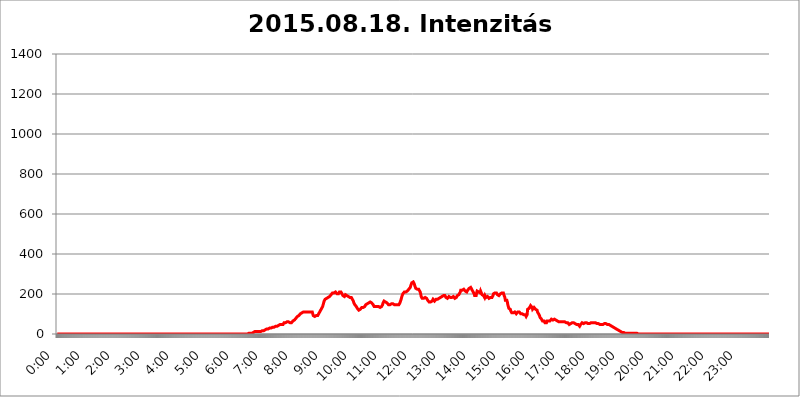
| Category | 2015.08.18. Intenzitás [W/m^2] |
|---|---|
| 0.0 | 0 |
| 0.0006944444444444445 | 0 |
| 0.001388888888888889 | 0 |
| 0.0020833333333333333 | 0 |
| 0.002777777777777778 | 0 |
| 0.003472222222222222 | 0 |
| 0.004166666666666667 | 0 |
| 0.004861111111111111 | 0 |
| 0.005555555555555556 | 0 |
| 0.0062499999999999995 | 0 |
| 0.006944444444444444 | 0 |
| 0.007638888888888889 | 0 |
| 0.008333333333333333 | 0 |
| 0.009027777777777779 | 0 |
| 0.009722222222222222 | 0 |
| 0.010416666666666666 | 0 |
| 0.011111111111111112 | 0 |
| 0.011805555555555555 | 0 |
| 0.012499999999999999 | 0 |
| 0.013194444444444444 | 0 |
| 0.013888888888888888 | 0 |
| 0.014583333333333332 | 0 |
| 0.015277777777777777 | 0 |
| 0.015972222222222224 | 0 |
| 0.016666666666666666 | 0 |
| 0.017361111111111112 | 0 |
| 0.018055555555555557 | 0 |
| 0.01875 | 0 |
| 0.019444444444444445 | 0 |
| 0.02013888888888889 | 0 |
| 0.020833333333333332 | 0 |
| 0.02152777777777778 | 0 |
| 0.022222222222222223 | 0 |
| 0.02291666666666667 | 0 |
| 0.02361111111111111 | 0 |
| 0.024305555555555556 | 0 |
| 0.024999999999999998 | 0 |
| 0.025694444444444447 | 0 |
| 0.02638888888888889 | 0 |
| 0.027083333333333334 | 0 |
| 0.027777777777777776 | 0 |
| 0.02847222222222222 | 0 |
| 0.029166666666666664 | 0 |
| 0.029861111111111113 | 0 |
| 0.030555555555555555 | 0 |
| 0.03125 | 0 |
| 0.03194444444444445 | 0 |
| 0.03263888888888889 | 0 |
| 0.03333333333333333 | 0 |
| 0.034027777777777775 | 0 |
| 0.034722222222222224 | 0 |
| 0.035416666666666666 | 0 |
| 0.036111111111111115 | 0 |
| 0.03680555555555556 | 0 |
| 0.0375 | 0 |
| 0.03819444444444444 | 0 |
| 0.03888888888888889 | 0 |
| 0.03958333333333333 | 0 |
| 0.04027777777777778 | 0 |
| 0.04097222222222222 | 0 |
| 0.041666666666666664 | 0 |
| 0.042361111111111106 | 0 |
| 0.04305555555555556 | 0 |
| 0.043750000000000004 | 0 |
| 0.044444444444444446 | 0 |
| 0.04513888888888889 | 0 |
| 0.04583333333333334 | 0 |
| 0.04652777777777778 | 0 |
| 0.04722222222222222 | 0 |
| 0.04791666666666666 | 0 |
| 0.04861111111111111 | 0 |
| 0.049305555555555554 | 0 |
| 0.049999999999999996 | 0 |
| 0.05069444444444445 | 0 |
| 0.051388888888888894 | 0 |
| 0.052083333333333336 | 0 |
| 0.05277777777777778 | 0 |
| 0.05347222222222222 | 0 |
| 0.05416666666666667 | 0 |
| 0.05486111111111111 | 0 |
| 0.05555555555555555 | 0 |
| 0.05625 | 0 |
| 0.05694444444444444 | 0 |
| 0.057638888888888885 | 0 |
| 0.05833333333333333 | 0 |
| 0.05902777777777778 | 0 |
| 0.059722222222222225 | 0 |
| 0.06041666666666667 | 0 |
| 0.061111111111111116 | 0 |
| 0.06180555555555556 | 0 |
| 0.0625 | 0 |
| 0.06319444444444444 | 0 |
| 0.06388888888888888 | 0 |
| 0.06458333333333334 | 0 |
| 0.06527777777777778 | 0 |
| 0.06597222222222222 | 0 |
| 0.06666666666666667 | 0 |
| 0.06736111111111111 | 0 |
| 0.06805555555555555 | 0 |
| 0.06874999999999999 | 0 |
| 0.06944444444444443 | 0 |
| 0.07013888888888889 | 0 |
| 0.07083333333333333 | 0 |
| 0.07152777777777779 | 0 |
| 0.07222222222222223 | 0 |
| 0.07291666666666667 | 0 |
| 0.07361111111111111 | 0 |
| 0.07430555555555556 | 0 |
| 0.075 | 0 |
| 0.07569444444444444 | 0 |
| 0.0763888888888889 | 0 |
| 0.07708333333333334 | 0 |
| 0.07777777777777778 | 0 |
| 0.07847222222222222 | 0 |
| 0.07916666666666666 | 0 |
| 0.0798611111111111 | 0 |
| 0.08055555555555556 | 0 |
| 0.08125 | 0 |
| 0.08194444444444444 | 0 |
| 0.08263888888888889 | 0 |
| 0.08333333333333333 | 0 |
| 0.08402777777777777 | 0 |
| 0.08472222222222221 | 0 |
| 0.08541666666666665 | 0 |
| 0.08611111111111112 | 0 |
| 0.08680555555555557 | 0 |
| 0.08750000000000001 | 0 |
| 0.08819444444444445 | 0 |
| 0.08888888888888889 | 0 |
| 0.08958333333333333 | 0 |
| 0.09027777777777778 | 0 |
| 0.09097222222222222 | 0 |
| 0.09166666666666667 | 0 |
| 0.09236111111111112 | 0 |
| 0.09305555555555556 | 0 |
| 0.09375 | 0 |
| 0.09444444444444444 | 0 |
| 0.09513888888888888 | 0 |
| 0.09583333333333333 | 0 |
| 0.09652777777777777 | 0 |
| 0.09722222222222222 | 0 |
| 0.09791666666666667 | 0 |
| 0.09861111111111111 | 0 |
| 0.09930555555555555 | 0 |
| 0.09999999999999999 | 0 |
| 0.10069444444444443 | 0 |
| 0.1013888888888889 | 0 |
| 0.10208333333333335 | 0 |
| 0.10277777777777779 | 0 |
| 0.10347222222222223 | 0 |
| 0.10416666666666667 | 0 |
| 0.10486111111111111 | 0 |
| 0.10555555555555556 | 0 |
| 0.10625 | 0 |
| 0.10694444444444444 | 0 |
| 0.1076388888888889 | 0 |
| 0.10833333333333334 | 0 |
| 0.10902777777777778 | 0 |
| 0.10972222222222222 | 0 |
| 0.1111111111111111 | 0 |
| 0.11180555555555556 | 0 |
| 0.11180555555555556 | 0 |
| 0.1125 | 0 |
| 0.11319444444444444 | 0 |
| 0.11388888888888889 | 0 |
| 0.11458333333333333 | 0 |
| 0.11527777777777777 | 0 |
| 0.11597222222222221 | 0 |
| 0.11666666666666665 | 0 |
| 0.1173611111111111 | 0 |
| 0.11805555555555557 | 0 |
| 0.11944444444444445 | 0 |
| 0.12013888888888889 | 0 |
| 0.12083333333333333 | 0 |
| 0.12152777777777778 | 0 |
| 0.12222222222222223 | 0 |
| 0.12291666666666667 | 0 |
| 0.12291666666666667 | 0 |
| 0.12361111111111112 | 0 |
| 0.12430555555555556 | 0 |
| 0.125 | 0 |
| 0.12569444444444444 | 0 |
| 0.12638888888888888 | 0 |
| 0.12708333333333333 | 0 |
| 0.16875 | 0 |
| 0.12847222222222224 | 0 |
| 0.12916666666666668 | 0 |
| 0.12986111111111112 | 0 |
| 0.13055555555555556 | 0 |
| 0.13125 | 0 |
| 0.13194444444444445 | 0 |
| 0.1326388888888889 | 0 |
| 0.13333333333333333 | 0 |
| 0.13402777777777777 | 0 |
| 0.13402777777777777 | 0 |
| 0.13472222222222222 | 0 |
| 0.13541666666666666 | 0 |
| 0.1361111111111111 | 0 |
| 0.13749999999999998 | 0 |
| 0.13819444444444443 | 0 |
| 0.1388888888888889 | 0 |
| 0.13958333333333334 | 0 |
| 0.14027777777777778 | 0 |
| 0.14097222222222222 | 0 |
| 0.14166666666666666 | 0 |
| 0.1423611111111111 | 0 |
| 0.14305555555555557 | 0 |
| 0.14375000000000002 | 0 |
| 0.14444444444444446 | 0 |
| 0.1451388888888889 | 0 |
| 0.1451388888888889 | 0 |
| 0.14652777777777778 | 0 |
| 0.14722222222222223 | 0 |
| 0.14791666666666667 | 0 |
| 0.1486111111111111 | 0 |
| 0.14930555555555555 | 0 |
| 0.15 | 0 |
| 0.15069444444444444 | 0 |
| 0.15138888888888888 | 0 |
| 0.15208333333333332 | 0 |
| 0.15277777777777776 | 0 |
| 0.15347222222222223 | 0 |
| 0.15416666666666667 | 0 |
| 0.15486111111111112 | 0 |
| 0.15555555555555556 | 0 |
| 0.15625 | 0 |
| 0.15694444444444444 | 0 |
| 0.15763888888888888 | 0 |
| 0.15833333333333333 | 0 |
| 0.15902777777777777 | 0 |
| 0.15972222222222224 | 0 |
| 0.16041666666666668 | 0 |
| 0.16111111111111112 | 0 |
| 0.16180555555555556 | 0 |
| 0.1625 | 0 |
| 0.16319444444444445 | 0 |
| 0.1638888888888889 | 0 |
| 0.16458333333333333 | 0 |
| 0.16527777777777777 | 0 |
| 0.16597222222222222 | 0 |
| 0.16666666666666666 | 0 |
| 0.1673611111111111 | 0 |
| 0.16805555555555554 | 0 |
| 0.16874999999999998 | 0 |
| 0.16944444444444443 | 0 |
| 0.17013888888888887 | 0 |
| 0.1708333333333333 | 0 |
| 0.17152777777777775 | 0 |
| 0.17222222222222225 | 0 |
| 0.1729166666666667 | 0 |
| 0.17361111111111113 | 0 |
| 0.17430555555555557 | 0 |
| 0.17500000000000002 | 0 |
| 0.17569444444444446 | 0 |
| 0.1763888888888889 | 0 |
| 0.17708333333333334 | 0 |
| 0.17777777777777778 | 0 |
| 0.17847222222222223 | 0 |
| 0.17916666666666667 | 0 |
| 0.1798611111111111 | 0 |
| 0.18055555555555555 | 0 |
| 0.18125 | 0 |
| 0.18194444444444444 | 0 |
| 0.1826388888888889 | 0 |
| 0.18333333333333335 | 0 |
| 0.1840277777777778 | 0 |
| 0.18472222222222223 | 0 |
| 0.18541666666666667 | 0 |
| 0.18611111111111112 | 0 |
| 0.18680555555555556 | 0 |
| 0.1875 | 0 |
| 0.18819444444444444 | 0 |
| 0.18888888888888888 | 0 |
| 0.18958333333333333 | 0 |
| 0.19027777777777777 | 0 |
| 0.1909722222222222 | 0 |
| 0.19166666666666665 | 0 |
| 0.19236111111111112 | 0 |
| 0.19305555555555554 | 0 |
| 0.19375 | 0 |
| 0.19444444444444445 | 0 |
| 0.1951388888888889 | 0 |
| 0.19583333333333333 | 0 |
| 0.19652777777777777 | 0 |
| 0.19722222222222222 | 0 |
| 0.19791666666666666 | 0 |
| 0.1986111111111111 | 0 |
| 0.19930555555555554 | 0 |
| 0.19999999999999998 | 0 |
| 0.20069444444444443 | 0 |
| 0.20138888888888887 | 0 |
| 0.2020833333333333 | 0 |
| 0.2027777777777778 | 0 |
| 0.2034722222222222 | 0 |
| 0.2041666666666667 | 0 |
| 0.20486111111111113 | 0 |
| 0.20555555555555557 | 0 |
| 0.20625000000000002 | 0 |
| 0.20694444444444446 | 0 |
| 0.2076388888888889 | 0 |
| 0.20833333333333334 | 0 |
| 0.20902777777777778 | 0 |
| 0.20972222222222223 | 0 |
| 0.21041666666666667 | 0 |
| 0.2111111111111111 | 0 |
| 0.21180555555555555 | 0 |
| 0.2125 | 0 |
| 0.21319444444444444 | 0 |
| 0.2138888888888889 | 0 |
| 0.21458333333333335 | 0 |
| 0.2152777777777778 | 0 |
| 0.21597222222222223 | 0 |
| 0.21666666666666667 | 0 |
| 0.21736111111111112 | 0 |
| 0.21805555555555556 | 0 |
| 0.21875 | 0 |
| 0.21944444444444444 | 0 |
| 0.22013888888888888 | 0 |
| 0.22083333333333333 | 0 |
| 0.22152777777777777 | 0 |
| 0.2222222222222222 | 0 |
| 0.22291666666666665 | 0 |
| 0.2236111111111111 | 0 |
| 0.22430555555555556 | 0 |
| 0.225 | 0 |
| 0.22569444444444445 | 0 |
| 0.2263888888888889 | 0 |
| 0.22708333333333333 | 0 |
| 0.22777777777777777 | 0 |
| 0.22847222222222222 | 0 |
| 0.22916666666666666 | 0 |
| 0.2298611111111111 | 0 |
| 0.23055555555555554 | 0 |
| 0.23124999999999998 | 0 |
| 0.23194444444444443 | 0 |
| 0.23263888888888887 | 0 |
| 0.2333333333333333 | 0 |
| 0.2340277777777778 | 0 |
| 0.2347222222222222 | 0 |
| 0.2354166666666667 | 0 |
| 0.23611111111111113 | 0 |
| 0.23680555555555557 | 0 |
| 0.23750000000000002 | 0 |
| 0.23819444444444446 | 0 |
| 0.2388888888888889 | 0 |
| 0.23958333333333334 | 0 |
| 0.24027777777777778 | 0 |
| 0.24097222222222223 | 0 |
| 0.24166666666666667 | 0 |
| 0.2423611111111111 | 0 |
| 0.24305555555555555 | 0 |
| 0.24375 | 0 |
| 0.24444444444444446 | 0 |
| 0.24513888888888888 | 0 |
| 0.24583333333333335 | 0 |
| 0.2465277777777778 | 0 |
| 0.24722222222222223 | 0 |
| 0.24791666666666667 | 0 |
| 0.24861111111111112 | 0 |
| 0.24930555555555556 | 0 |
| 0.25 | 0 |
| 0.25069444444444444 | 0 |
| 0.2513888888888889 | 0 |
| 0.2520833333333333 | 0 |
| 0.25277777777777777 | 0 |
| 0.2534722222222222 | 0 |
| 0.25416666666666665 | 0 |
| 0.2548611111111111 | 0 |
| 0.2555555555555556 | 0 |
| 0.25625000000000003 | 0 |
| 0.2569444444444445 | 0 |
| 0.2576388888888889 | 0 |
| 0.25833333333333336 | 0 |
| 0.2590277777777778 | 0 |
| 0.25972222222222224 | 0 |
| 0.2604166666666667 | 0 |
| 0.2611111111111111 | 3.525 |
| 0.26180555555555557 | 0 |
| 0.2625 | 0 |
| 0.26319444444444445 | 0 |
| 0.2638888888888889 | 0 |
| 0.26458333333333334 | 0 |
| 0.2652777777777778 | 0 |
| 0.2659722222222222 | 0 |
| 0.26666666666666666 | 0 |
| 0.2673611111111111 | 3.525 |
| 0.26805555555555555 | 3.525 |
| 0.26875 | 3.525 |
| 0.26944444444444443 | 3.525 |
| 0.2701388888888889 | 3.525 |
| 0.2708333333333333 | 3.525 |
| 0.27152777777777776 | 3.525 |
| 0.2722222222222222 | 3.525 |
| 0.27291666666666664 | 3.525 |
| 0.2736111111111111 | 3.525 |
| 0.2743055555555555 | 7.887 |
| 0.27499999999999997 | 7.887 |
| 0.27569444444444446 | 7.887 |
| 0.27638888888888885 | 12.257 |
| 0.27708333333333335 | 12.257 |
| 0.2777777777777778 | 12.257 |
| 0.27847222222222223 | 12.257 |
| 0.2791666666666667 | 12.257 |
| 0.2798611111111111 | 12.257 |
| 0.28055555555555556 | 12.257 |
| 0.28125 | 12.257 |
| 0.28194444444444444 | 12.257 |
| 0.2826388888888889 | 12.257 |
| 0.2833333333333333 | 12.257 |
| 0.28402777777777777 | 12.257 |
| 0.2847222222222222 | 12.257 |
| 0.28541666666666665 | 12.257 |
| 0.28611111111111115 | 12.257 |
| 0.28680555555555554 | 16.636 |
| 0.28750000000000003 | 16.636 |
| 0.2881944444444445 | 16.636 |
| 0.2888888888888889 | 16.636 |
| 0.28958333333333336 | 16.636 |
| 0.2902777777777778 | 16.636 |
| 0.29097222222222224 | 21.024 |
| 0.2916666666666667 | 21.024 |
| 0.2923611111111111 | 21.024 |
| 0.29305555555555557 | 21.024 |
| 0.29375 | 25.419 |
| 0.29444444444444445 | 25.419 |
| 0.2951388888888889 | 25.419 |
| 0.29583333333333334 | 25.419 |
| 0.2965277777777778 | 29.823 |
| 0.2972222222222222 | 29.823 |
| 0.29791666666666666 | 29.823 |
| 0.2986111111111111 | 29.823 |
| 0.29930555555555555 | 29.823 |
| 0.3 | 29.823 |
| 0.30069444444444443 | 34.234 |
| 0.3013888888888889 | 34.234 |
| 0.3020833333333333 | 34.234 |
| 0.30277777777777776 | 34.234 |
| 0.3034722222222222 | 34.234 |
| 0.30416666666666664 | 34.234 |
| 0.3048611111111111 | 38.653 |
| 0.3055555555555555 | 38.653 |
| 0.30624999999999997 | 38.653 |
| 0.3069444444444444 | 38.653 |
| 0.3076388888888889 | 38.653 |
| 0.30833333333333335 | 38.653 |
| 0.3090277777777778 | 38.653 |
| 0.30972222222222223 | 43.079 |
| 0.3104166666666667 | 43.079 |
| 0.3111111111111111 | 47.511 |
| 0.31180555555555556 | 47.511 |
| 0.3125 | 47.511 |
| 0.31319444444444444 | 47.511 |
| 0.3138888888888889 | 47.511 |
| 0.3145833333333333 | 47.511 |
| 0.31527777777777777 | 47.511 |
| 0.3159722222222222 | 47.511 |
| 0.31666666666666665 | 47.511 |
| 0.31736111111111115 | 51.951 |
| 0.31805555555555554 | 56.398 |
| 0.31875000000000003 | 56.398 |
| 0.3194444444444445 | 56.398 |
| 0.3201388888888889 | 56.398 |
| 0.32083333333333336 | 56.398 |
| 0.3215277777777778 | 60.85 |
| 0.32222222222222224 | 60.85 |
| 0.3229166666666667 | 60.85 |
| 0.3236111111111111 | 60.85 |
| 0.32430555555555557 | 60.85 |
| 0.325 | 60.85 |
| 0.32569444444444445 | 60.85 |
| 0.3263888888888889 | 56.398 |
| 0.32708333333333334 | 56.398 |
| 0.3277777777777778 | 56.398 |
| 0.3284722222222222 | 56.398 |
| 0.32916666666666666 | 60.85 |
| 0.3298611111111111 | 60.85 |
| 0.33055555555555555 | 65.31 |
| 0.33125 | 69.775 |
| 0.33194444444444443 | 69.775 |
| 0.3326388888888889 | 69.775 |
| 0.3333333333333333 | 74.246 |
| 0.3340277777777778 | 74.246 |
| 0.3347222222222222 | 78.722 |
| 0.3354166666666667 | 78.722 |
| 0.3361111111111111 | 83.205 |
| 0.3368055555555556 | 87.692 |
| 0.33749999999999997 | 87.692 |
| 0.33819444444444446 | 92.184 |
| 0.33888888888888885 | 92.184 |
| 0.33958333333333335 | 96.682 |
| 0.34027777777777773 | 96.682 |
| 0.34097222222222223 | 101.184 |
| 0.3416666666666666 | 101.184 |
| 0.3423611111111111 | 101.184 |
| 0.3430555555555555 | 105.69 |
| 0.34375 | 105.69 |
| 0.3444444444444445 | 105.69 |
| 0.3451388888888889 | 110.201 |
| 0.3458333333333334 | 110.201 |
| 0.34652777777777777 | 110.201 |
| 0.34722222222222227 | 110.201 |
| 0.34791666666666665 | 110.201 |
| 0.34861111111111115 | 110.201 |
| 0.34930555555555554 | 110.201 |
| 0.35000000000000003 | 110.201 |
| 0.3506944444444444 | 110.201 |
| 0.3513888888888889 | 110.201 |
| 0.3520833333333333 | 110.201 |
| 0.3527777777777778 | 110.201 |
| 0.3534722222222222 | 110.201 |
| 0.3541666666666667 | 114.716 |
| 0.3548611111111111 | 110.201 |
| 0.35555555555555557 | 110.201 |
| 0.35625 | 110.201 |
| 0.35694444444444445 | 110.201 |
| 0.3576388888888889 | 110.201 |
| 0.35833333333333334 | 110.201 |
| 0.3590277777777778 | 92.184 |
| 0.3597222222222222 | 92.184 |
| 0.36041666666666666 | 87.692 |
| 0.3611111111111111 | 87.692 |
| 0.36180555555555555 | 87.692 |
| 0.3625 | 92.184 |
| 0.36319444444444443 | 92.184 |
| 0.3638888888888889 | 92.184 |
| 0.3645833333333333 | 92.184 |
| 0.3652777777777778 | 92.184 |
| 0.3659722222222222 | 96.682 |
| 0.3666666666666667 | 101.184 |
| 0.3673611111111111 | 101.184 |
| 0.3680555555555556 | 110.201 |
| 0.36874999999999997 | 114.716 |
| 0.36944444444444446 | 119.235 |
| 0.37013888888888885 | 123.758 |
| 0.37083333333333335 | 128.284 |
| 0.37152777777777773 | 132.814 |
| 0.37222222222222223 | 137.347 |
| 0.3729166666666666 | 146.423 |
| 0.3736111111111111 | 155.509 |
| 0.3743055555555555 | 164.605 |
| 0.375 | 169.156 |
| 0.3756944444444445 | 173.709 |
| 0.3763888888888889 | 178.264 |
| 0.3770833333333334 | 178.264 |
| 0.37777777777777777 | 178.264 |
| 0.37847222222222227 | 178.264 |
| 0.37916666666666665 | 182.82 |
| 0.37986111111111115 | 182.82 |
| 0.38055555555555554 | 182.82 |
| 0.38125000000000003 | 187.378 |
| 0.3819444444444444 | 187.378 |
| 0.3826388888888889 | 191.937 |
| 0.3833333333333333 | 191.937 |
| 0.3840277777777778 | 196.497 |
| 0.3847222222222222 | 201.058 |
| 0.3854166666666667 | 201.058 |
| 0.3861111111111111 | 205.62 |
| 0.38680555555555557 | 205.62 |
| 0.3875 | 205.62 |
| 0.38819444444444445 | 205.62 |
| 0.3888888888888889 | 210.182 |
| 0.38958333333333334 | 210.182 |
| 0.3902777777777778 | 210.182 |
| 0.3909722222222222 | 205.62 |
| 0.39166666666666666 | 205.62 |
| 0.3923611111111111 | 201.058 |
| 0.39305555555555555 | 201.058 |
| 0.39375 | 201.058 |
| 0.39444444444444443 | 201.058 |
| 0.3951388888888889 | 205.62 |
| 0.3958333333333333 | 210.182 |
| 0.3965277777777778 | 210.182 |
| 0.3972222222222222 | 210.182 |
| 0.3979166666666667 | 210.182 |
| 0.3986111111111111 | 205.62 |
| 0.3993055555555556 | 201.058 |
| 0.39999999999999997 | 196.497 |
| 0.40069444444444446 | 191.937 |
| 0.40138888888888885 | 187.378 |
| 0.40208333333333335 | 187.378 |
| 0.40277777777777773 | 187.378 |
| 0.40347222222222223 | 191.937 |
| 0.4041666666666666 | 196.497 |
| 0.4048611111111111 | 196.497 |
| 0.4055555555555555 | 196.497 |
| 0.40625 | 191.937 |
| 0.4069444444444445 | 191.937 |
| 0.4076388888888889 | 191.937 |
| 0.4083333333333334 | 187.378 |
| 0.40902777777777777 | 187.378 |
| 0.40972222222222227 | 187.378 |
| 0.41041666666666665 | 182.82 |
| 0.41111111111111115 | 182.82 |
| 0.41180555555555554 | 182.82 |
| 0.41250000000000003 | 182.82 |
| 0.4131944444444444 | 178.264 |
| 0.4138888888888889 | 173.709 |
| 0.4145833333333333 | 169.156 |
| 0.4152777777777778 | 164.605 |
| 0.4159722222222222 | 155.509 |
| 0.4166666666666667 | 150.964 |
| 0.4173611111111111 | 146.423 |
| 0.41805555555555557 | 146.423 |
| 0.41875 | 141.884 |
| 0.41944444444444445 | 137.347 |
| 0.4201388888888889 | 132.814 |
| 0.42083333333333334 | 128.284 |
| 0.4215277777777778 | 128.284 |
| 0.4222222222222222 | 123.758 |
| 0.42291666666666666 | 119.235 |
| 0.4236111111111111 | 119.235 |
| 0.42430555555555555 | 119.235 |
| 0.425 | 123.758 |
| 0.42569444444444443 | 123.758 |
| 0.4263888888888889 | 128.284 |
| 0.4270833333333333 | 132.814 |
| 0.4277777777777778 | 132.814 |
| 0.4284722222222222 | 132.814 |
| 0.4291666666666667 | 132.814 |
| 0.4298611111111111 | 132.814 |
| 0.4305555555555556 | 132.814 |
| 0.43124999999999997 | 137.347 |
| 0.43194444444444446 | 141.884 |
| 0.43263888888888885 | 146.423 |
| 0.43333333333333335 | 146.423 |
| 0.43402777777777773 | 150.964 |
| 0.43472222222222223 | 150.964 |
| 0.4354166666666666 | 150.964 |
| 0.4361111111111111 | 155.509 |
| 0.4368055555555555 | 155.509 |
| 0.4375 | 160.056 |
| 0.4381944444444445 | 160.056 |
| 0.4388888888888889 | 160.056 |
| 0.4395833333333334 | 160.056 |
| 0.44027777777777777 | 160.056 |
| 0.44097222222222227 | 155.509 |
| 0.44166666666666665 | 155.509 |
| 0.44236111111111115 | 150.964 |
| 0.44305555555555554 | 146.423 |
| 0.44375000000000003 | 141.884 |
| 0.4444444444444444 | 137.347 |
| 0.4451388888888889 | 132.814 |
| 0.4458333333333333 | 137.347 |
| 0.4465277777777778 | 137.347 |
| 0.4472222222222222 | 137.347 |
| 0.4479166666666667 | 137.347 |
| 0.4486111111111111 | 137.347 |
| 0.44930555555555557 | 137.347 |
| 0.45 | 137.347 |
| 0.45069444444444445 | 137.347 |
| 0.4513888888888889 | 137.347 |
| 0.45208333333333334 | 132.814 |
| 0.4527777777777778 | 132.814 |
| 0.4534722222222222 | 137.347 |
| 0.45416666666666666 | 137.347 |
| 0.4548611111111111 | 137.347 |
| 0.45555555555555555 | 141.884 |
| 0.45625 | 146.423 |
| 0.45694444444444443 | 155.509 |
| 0.4576388888888889 | 160.056 |
| 0.4583333333333333 | 164.605 |
| 0.4590277777777778 | 164.605 |
| 0.4597222222222222 | 164.605 |
| 0.4604166666666667 | 160.056 |
| 0.4611111111111111 | 160.056 |
| 0.4618055555555556 | 155.509 |
| 0.46249999999999997 | 155.509 |
| 0.46319444444444446 | 150.964 |
| 0.46388888888888885 | 150.964 |
| 0.46458333333333335 | 146.423 |
| 0.46527777777777773 | 146.423 |
| 0.46597222222222223 | 146.423 |
| 0.4666666666666666 | 146.423 |
| 0.4673611111111111 | 146.423 |
| 0.4680555555555555 | 150.964 |
| 0.46875 | 150.964 |
| 0.4694444444444445 | 150.964 |
| 0.4701388888888889 | 150.964 |
| 0.4708333333333334 | 150.964 |
| 0.47152777777777777 | 150.964 |
| 0.47222222222222227 | 150.964 |
| 0.47291666666666665 | 146.423 |
| 0.47361111111111115 | 150.964 |
| 0.47430555555555554 | 150.964 |
| 0.47500000000000003 | 146.423 |
| 0.4756944444444444 | 150.964 |
| 0.4763888888888889 | 146.423 |
| 0.4770833333333333 | 146.423 |
| 0.4777777777777778 | 146.423 |
| 0.4784722222222222 | 146.423 |
| 0.4791666666666667 | 146.423 |
| 0.4798611111111111 | 150.964 |
| 0.48055555555555557 | 155.509 |
| 0.48125 | 160.056 |
| 0.48194444444444445 | 169.156 |
| 0.4826388888888889 | 178.264 |
| 0.48333333333333334 | 187.378 |
| 0.4840277777777778 | 191.937 |
| 0.4847222222222222 | 201.058 |
| 0.48541666666666666 | 205.62 |
| 0.4861111111111111 | 205.62 |
| 0.48680555555555555 | 210.182 |
| 0.4875 | 210.182 |
| 0.48819444444444443 | 210.182 |
| 0.4888888888888889 | 210.182 |
| 0.4895833333333333 | 214.746 |
| 0.4902777777777778 | 214.746 |
| 0.4909722222222222 | 214.746 |
| 0.4916666666666667 | 214.746 |
| 0.4923611111111111 | 219.309 |
| 0.4930555555555556 | 223.873 |
| 0.49374999999999997 | 228.436 |
| 0.49444444444444446 | 228.436 |
| 0.49513888888888885 | 233 |
| 0.49583333333333335 | 242.127 |
| 0.49652777777777773 | 246.689 |
| 0.49722222222222223 | 255.813 |
| 0.4979166666666666 | 260.373 |
| 0.4986111111111111 | 260.373 |
| 0.4993055555555555 | 260.373 |
| 0.5 | 255.813 |
| 0.5006944444444444 | 251.251 |
| 0.5013888888888889 | 242.127 |
| 0.5020833333333333 | 237.564 |
| 0.5027777777777778 | 228.436 |
| 0.5034722222222222 | 228.436 |
| 0.5041666666666667 | 223.873 |
| 0.5048611111111111 | 223.873 |
| 0.5055555555555555 | 219.309 |
| 0.50625 | 223.873 |
| 0.5069444444444444 | 223.873 |
| 0.5076388888888889 | 223.873 |
| 0.5083333333333333 | 219.309 |
| 0.5090277777777777 | 210.182 |
| 0.5097222222222222 | 201.058 |
| 0.5104166666666666 | 187.378 |
| 0.5111111111111112 | 182.82 |
| 0.5118055555555555 | 178.264 |
| 0.5125000000000001 | 178.264 |
| 0.5131944444444444 | 178.264 |
| 0.513888888888889 | 178.264 |
| 0.5145833333333333 | 178.264 |
| 0.5152777777777778 | 182.82 |
| 0.5159722222222222 | 182.82 |
| 0.5166666666666667 | 182.82 |
| 0.517361111111111 | 182.82 |
| 0.5180555555555556 | 178.264 |
| 0.5187499999999999 | 173.709 |
| 0.5194444444444445 | 169.156 |
| 0.5201388888888888 | 164.605 |
| 0.5208333333333334 | 164.605 |
| 0.5215277777777778 | 160.056 |
| 0.5222222222222223 | 160.056 |
| 0.5229166666666667 | 160.056 |
| 0.5236111111111111 | 160.056 |
| 0.5243055555555556 | 160.056 |
| 0.525 | 164.605 |
| 0.5256944444444445 | 164.605 |
| 0.5263888888888889 | 169.156 |
| 0.5270833333333333 | 173.709 |
| 0.5277777777777778 | 169.156 |
| 0.5284722222222222 | 169.156 |
| 0.5291666666666667 | 164.605 |
| 0.5298611111111111 | 164.605 |
| 0.5305555555555556 | 169.156 |
| 0.53125 | 173.709 |
| 0.5319444444444444 | 173.709 |
| 0.5326388888888889 | 173.709 |
| 0.5333333333333333 | 173.709 |
| 0.5340277777777778 | 173.709 |
| 0.5347222222222222 | 173.709 |
| 0.5354166666666667 | 178.264 |
| 0.5361111111111111 | 182.82 |
| 0.5368055555555555 | 182.82 |
| 0.5375 | 182.82 |
| 0.5381944444444444 | 182.82 |
| 0.5388888888888889 | 187.378 |
| 0.5395833333333333 | 187.378 |
| 0.5402777777777777 | 187.378 |
| 0.5409722222222222 | 187.378 |
| 0.5416666666666666 | 191.937 |
| 0.5423611111111112 | 191.937 |
| 0.5430555555555555 | 196.497 |
| 0.5437500000000001 | 191.937 |
| 0.5444444444444444 | 187.378 |
| 0.545138888888889 | 182.82 |
| 0.5458333333333333 | 178.264 |
| 0.5465277777777778 | 178.264 |
| 0.5472222222222222 | 178.264 |
| 0.5479166666666667 | 182.82 |
| 0.548611111111111 | 182.82 |
| 0.5493055555555556 | 187.378 |
| 0.5499999999999999 | 187.378 |
| 0.5506944444444445 | 187.378 |
| 0.5513888888888888 | 182.82 |
| 0.5520833333333334 | 182.82 |
| 0.5527777777777778 | 182.82 |
| 0.5534722222222223 | 182.82 |
| 0.5541666666666667 | 187.378 |
| 0.5548611111111111 | 187.378 |
| 0.5555555555555556 | 187.378 |
| 0.55625 | 182.82 |
| 0.5569444444444445 | 182.82 |
| 0.5576388888888889 | 178.264 |
| 0.5583333333333333 | 178.264 |
| 0.5590277777777778 | 178.264 |
| 0.5597222222222222 | 182.82 |
| 0.5604166666666667 | 187.378 |
| 0.5611111111111111 | 191.937 |
| 0.5618055555555556 | 191.937 |
| 0.5625 | 196.497 |
| 0.5631944444444444 | 196.497 |
| 0.5638888888888889 | 196.497 |
| 0.5645833333333333 | 201.058 |
| 0.5652777777777778 | 210.182 |
| 0.5659722222222222 | 219.309 |
| 0.5666666666666667 | 223.873 |
| 0.5673611111111111 | 223.873 |
| 0.5680555555555555 | 219.309 |
| 0.56875 | 214.746 |
| 0.5694444444444444 | 214.746 |
| 0.5701388888888889 | 223.873 |
| 0.5708333333333333 | 223.873 |
| 0.5715277777777777 | 219.309 |
| 0.5722222222222222 | 214.746 |
| 0.5729166666666666 | 210.182 |
| 0.5736111111111112 | 210.182 |
| 0.5743055555555555 | 210.182 |
| 0.5750000000000001 | 210.182 |
| 0.5756944444444444 | 219.309 |
| 0.576388888888889 | 223.873 |
| 0.5770833333333333 | 223.873 |
| 0.5777777777777778 | 228.436 |
| 0.5784722222222222 | 228.436 |
| 0.5791666666666667 | 233 |
| 0.579861111111111 | 233 |
| 0.5805555555555556 | 228.436 |
| 0.5812499999999999 | 228.436 |
| 0.5819444444444445 | 219.309 |
| 0.5826388888888888 | 219.309 |
| 0.5833333333333334 | 210.182 |
| 0.5840277777777778 | 205.62 |
| 0.5847222222222223 | 201.058 |
| 0.5854166666666667 | 191.937 |
| 0.5861111111111111 | 187.378 |
| 0.5868055555555556 | 187.378 |
| 0.5875 | 191.937 |
| 0.5881944444444445 | 205.62 |
| 0.5888888888888889 | 214.746 |
| 0.5895833333333333 | 210.182 |
| 0.5902777777777778 | 210.182 |
| 0.5909722222222222 | 210.182 |
| 0.5916666666666667 | 210.182 |
| 0.5923611111111111 | 205.62 |
| 0.5930555555555556 | 205.62 |
| 0.59375 | 214.746 |
| 0.5944444444444444 | 219.309 |
| 0.5951388888888889 | 210.182 |
| 0.5958333333333333 | 196.497 |
| 0.5965277777777778 | 191.937 |
| 0.5972222222222222 | 191.937 |
| 0.5979166666666667 | 191.937 |
| 0.5986111111111111 | 191.937 |
| 0.5993055555555555 | 182.82 |
| 0.6 | 191.937 |
| 0.6006944444444444 | 187.378 |
| 0.6013888888888889 | 182.82 |
| 0.6020833333333333 | 178.264 |
| 0.6027777777777777 | 182.82 |
| 0.6034722222222222 | 187.378 |
| 0.6041666666666666 | 187.378 |
| 0.6048611111111112 | 182.82 |
| 0.6055555555555555 | 178.264 |
| 0.6062500000000001 | 178.264 |
| 0.6069444444444444 | 178.264 |
| 0.607638888888889 | 182.82 |
| 0.6083333333333333 | 182.82 |
| 0.6090277777777778 | 182.82 |
| 0.6097222222222222 | 182.82 |
| 0.6104166666666667 | 187.378 |
| 0.611111111111111 | 191.937 |
| 0.6118055555555556 | 201.058 |
| 0.6124999999999999 | 196.497 |
| 0.6131944444444445 | 201.058 |
| 0.6138888888888888 | 205.62 |
| 0.6145833333333334 | 210.182 |
| 0.6152777777777778 | 205.62 |
| 0.6159722222222223 | 205.62 |
| 0.6166666666666667 | 201.058 |
| 0.6173611111111111 | 196.497 |
| 0.6180555555555556 | 191.937 |
| 0.61875 | 191.937 |
| 0.6194444444444445 | 191.937 |
| 0.6201388888888889 | 191.937 |
| 0.6208333333333333 | 191.937 |
| 0.6215277777777778 | 201.058 |
| 0.6222222222222222 | 205.62 |
| 0.6229166666666667 | 205.62 |
| 0.6236111111111111 | 205.62 |
| 0.6243055555555556 | 210.182 |
| 0.625 | 210.182 |
| 0.6256944444444444 | 205.62 |
| 0.6263888888888889 | 196.497 |
| 0.6270833333333333 | 191.937 |
| 0.6277777777777778 | 182.82 |
| 0.6284722222222222 | 169.156 |
| 0.6291666666666667 | 164.605 |
| 0.6298611111111111 | 164.605 |
| 0.6305555555555555 | 169.156 |
| 0.63125 | 160.056 |
| 0.6319444444444444 | 146.423 |
| 0.6326388888888889 | 137.347 |
| 0.6333333333333333 | 128.284 |
| 0.6340277777777777 | 123.758 |
| 0.6347222222222222 | 123.758 |
| 0.6354166666666666 | 123.758 |
| 0.6361111111111112 | 114.716 |
| 0.6368055555555555 | 110.201 |
| 0.6375000000000001 | 105.69 |
| 0.6381944444444444 | 110.201 |
| 0.638888888888889 | 110.201 |
| 0.6395833333333333 | 105.69 |
| 0.6402777777777778 | 105.69 |
| 0.6409722222222222 | 105.69 |
| 0.6416666666666667 | 110.201 |
| 0.642361111111111 | 110.201 |
| 0.6430555555555556 | 105.69 |
| 0.6437499999999999 | 101.184 |
| 0.6444444444444445 | 105.69 |
| 0.6451388888888888 | 105.69 |
| 0.6458333333333334 | 110.201 |
| 0.6465277777777778 | 110.201 |
| 0.6472222222222223 | 110.201 |
| 0.6479166666666667 | 110.201 |
| 0.6486111111111111 | 110.201 |
| 0.6493055555555556 | 105.69 |
| 0.65 | 101.184 |
| 0.6506944444444445 | 105.69 |
| 0.6513888888888889 | 105.69 |
| 0.6520833333333333 | 101.184 |
| 0.6527777777777778 | 96.682 |
| 0.6534722222222222 | 96.682 |
| 0.6541666666666667 | 96.682 |
| 0.6548611111111111 | 92.184 |
| 0.6555555555555556 | 92.184 |
| 0.65625 | 96.682 |
| 0.6569444444444444 | 96.682 |
| 0.6576388888888889 | 87.692 |
| 0.6583333333333333 | 92.184 |
| 0.6590277777777778 | 96.682 |
| 0.6597222222222222 | 123.758 |
| 0.6604166666666667 | 128.284 |
| 0.6611111111111111 | 128.284 |
| 0.6618055555555555 | 128.284 |
| 0.6625 | 132.814 |
| 0.6631944444444444 | 132.814 |
| 0.6638888888888889 | 141.884 |
| 0.6645833333333333 | 146.423 |
| 0.6652777777777777 | 137.347 |
| 0.6659722222222222 | 132.814 |
| 0.6666666666666666 | 123.758 |
| 0.6673611111111111 | 119.235 |
| 0.6680555555555556 | 128.284 |
| 0.6687500000000001 | 132.814 |
| 0.6694444444444444 | 132.814 |
| 0.6701388888888888 | 128.284 |
| 0.6708333333333334 | 123.758 |
| 0.6715277777777778 | 119.235 |
| 0.6722222222222222 | 119.235 |
| 0.6729166666666666 | 119.235 |
| 0.6736111111111112 | 110.201 |
| 0.6743055555555556 | 110.201 |
| 0.6749999999999999 | 101.184 |
| 0.6756944444444444 | 96.682 |
| 0.6763888888888889 | 92.184 |
| 0.6770833333333334 | 83.205 |
| 0.6777777777777777 | 83.205 |
| 0.6784722222222223 | 78.722 |
| 0.6791666666666667 | 74.246 |
| 0.6798611111111111 | 69.775 |
| 0.6805555555555555 | 65.31 |
| 0.68125 | 65.31 |
| 0.6819444444444445 | 65.31 |
| 0.6826388888888889 | 65.31 |
| 0.6833333333333332 | 60.85 |
| 0.6840277777777778 | 56.398 |
| 0.6847222222222222 | 56.398 |
| 0.6854166666666667 | 56.398 |
| 0.686111111111111 | 56.398 |
| 0.6868055555555556 | 65.31 |
| 0.6875 | 65.31 |
| 0.6881944444444444 | 65.31 |
| 0.688888888888889 | 65.31 |
| 0.6895833333333333 | 65.31 |
| 0.6902777777777778 | 65.31 |
| 0.6909722222222222 | 65.31 |
| 0.6916666666666668 | 65.31 |
| 0.6923611111111111 | 69.775 |
| 0.6930555555555555 | 74.246 |
| 0.69375 | 74.246 |
| 0.6944444444444445 | 74.246 |
| 0.6951388888888889 | 69.775 |
| 0.6958333333333333 | 74.246 |
| 0.6965277777777777 | 74.246 |
| 0.6972222222222223 | 74.246 |
| 0.6979166666666666 | 78.722 |
| 0.6986111111111111 | 74.246 |
| 0.6993055555555556 | 69.775 |
| 0.7000000000000001 | 69.775 |
| 0.7006944444444444 | 65.31 |
| 0.7013888888888888 | 65.31 |
| 0.7020833333333334 | 65.31 |
| 0.7027777777777778 | 60.85 |
| 0.7034722222222222 | 60.85 |
| 0.7041666666666666 | 60.85 |
| 0.7048611111111112 | 60.85 |
| 0.7055555555555556 | 60.85 |
| 0.7062499999999999 | 60.85 |
| 0.7069444444444444 | 60.85 |
| 0.7076388888888889 | 60.85 |
| 0.7083333333333334 | 60.85 |
| 0.7090277777777777 | 56.398 |
| 0.7097222222222223 | 60.85 |
| 0.7104166666666667 | 60.85 |
| 0.7111111111111111 | 60.85 |
| 0.7118055555555555 | 60.85 |
| 0.7125 | 60.85 |
| 0.7131944444444445 | 60.85 |
| 0.7138888888888889 | 56.398 |
| 0.7145833333333332 | 56.398 |
| 0.7152777777777778 | 56.398 |
| 0.7159722222222222 | 56.398 |
| 0.7166666666666667 | 56.398 |
| 0.717361111111111 | 51.951 |
| 0.7180555555555556 | 47.511 |
| 0.71875 | 47.511 |
| 0.7194444444444444 | 47.511 |
| 0.720138888888889 | 51.951 |
| 0.7208333333333333 | 56.398 |
| 0.7215277777777778 | 51.951 |
| 0.7222222222222222 | 56.398 |
| 0.7229166666666668 | 51.951 |
| 0.7236111111111111 | 51.951 |
| 0.7243055555555555 | 56.398 |
| 0.725 | 56.398 |
| 0.7256944444444445 | 51.951 |
| 0.7263888888888889 | 51.951 |
| 0.7270833333333333 | 47.511 |
| 0.7277777777777777 | 47.511 |
| 0.7284722222222223 | 47.511 |
| 0.7291666666666666 | 47.511 |
| 0.7298611111111111 | 47.511 |
| 0.7305555555555556 | 47.511 |
| 0.7312500000000001 | 43.079 |
| 0.7319444444444444 | 43.079 |
| 0.7326388888888888 | 38.653 |
| 0.7333333333333334 | 43.079 |
| 0.7340277777777778 | 47.511 |
| 0.7347222222222222 | 47.511 |
| 0.7354166666666666 | 51.951 |
| 0.7361111111111112 | 56.398 |
| 0.7368055555555556 | 56.398 |
| 0.7374999999999999 | 56.398 |
| 0.7381944444444444 | 51.951 |
| 0.7388888888888889 | 51.951 |
| 0.7395833333333334 | 56.398 |
| 0.7402777777777777 | 56.398 |
| 0.7409722222222223 | 56.398 |
| 0.7416666666666667 | 56.398 |
| 0.7423611111111111 | 56.398 |
| 0.7430555555555555 | 51.951 |
| 0.74375 | 51.951 |
| 0.7444444444444445 | 51.951 |
| 0.7451388888888889 | 56.398 |
| 0.7458333333333332 | 56.398 |
| 0.7465277777777778 | 51.951 |
| 0.7472222222222222 | 51.951 |
| 0.7479166666666667 | 56.398 |
| 0.748611111111111 | 56.398 |
| 0.7493055555555556 | 56.398 |
| 0.75 | 56.398 |
| 0.7506944444444444 | 56.398 |
| 0.751388888888889 | 56.398 |
| 0.7520833333333333 | 51.951 |
| 0.7527777777777778 | 56.398 |
| 0.7534722222222222 | 56.398 |
| 0.7541666666666668 | 56.398 |
| 0.7548611111111111 | 56.398 |
| 0.7555555555555555 | 56.398 |
| 0.75625 | 51.951 |
| 0.7569444444444445 | 51.951 |
| 0.7576388888888889 | 51.951 |
| 0.7583333333333333 | 51.951 |
| 0.7590277777777777 | 51.951 |
| 0.7597222222222223 | 51.951 |
| 0.7604166666666666 | 47.511 |
| 0.7611111111111111 | 47.511 |
| 0.7618055555555556 | 47.511 |
| 0.7625000000000001 | 47.511 |
| 0.7631944444444444 | 47.511 |
| 0.7638888888888888 | 47.511 |
| 0.7645833333333334 | 47.511 |
| 0.7652777777777778 | 47.511 |
| 0.7659722222222222 | 51.951 |
| 0.7666666666666666 | 51.951 |
| 0.7673611111111112 | 51.951 |
| 0.7680555555555556 | 51.951 |
| 0.7687499999999999 | 51.951 |
| 0.7694444444444444 | 51.951 |
| 0.7701388888888889 | 51.951 |
| 0.7708333333333334 | 51.951 |
| 0.7715277777777777 | 47.511 |
| 0.7722222222222223 | 47.511 |
| 0.7729166666666667 | 47.511 |
| 0.7736111111111111 | 47.511 |
| 0.7743055555555555 | 47.511 |
| 0.775 | 43.079 |
| 0.7756944444444445 | 43.079 |
| 0.7763888888888889 | 43.079 |
| 0.7770833333333332 | 43.079 |
| 0.7777777777777778 | 38.653 |
| 0.7784722222222222 | 38.653 |
| 0.7791666666666667 | 34.234 |
| 0.779861111111111 | 34.234 |
| 0.7805555555555556 | 29.823 |
| 0.78125 | 29.823 |
| 0.7819444444444444 | 29.823 |
| 0.782638888888889 | 29.823 |
| 0.7833333333333333 | 25.419 |
| 0.7840277777777778 | 25.419 |
| 0.7847222222222222 | 25.419 |
| 0.7854166666666668 | 21.024 |
| 0.7861111111111111 | 21.024 |
| 0.7868055555555555 | 21.024 |
| 0.7875 | 16.636 |
| 0.7881944444444445 | 16.636 |
| 0.7888888888888889 | 16.636 |
| 0.7895833333333333 | 12.257 |
| 0.7902777777777777 | 12.257 |
| 0.7909722222222223 | 12.257 |
| 0.7916666666666666 | 12.257 |
| 0.7923611111111111 | 7.887 |
| 0.7930555555555556 | 7.887 |
| 0.7937500000000001 | 7.887 |
| 0.7944444444444444 | 7.887 |
| 0.7951388888888888 | 7.887 |
| 0.7958333333333334 | 7.887 |
| 0.7965277777777778 | 3.525 |
| 0.7972222222222222 | 3.525 |
| 0.7979166666666666 | 7.887 |
| 0.7986111111111112 | 3.525 |
| 0.7993055555555556 | 3.525 |
| 0.7999999999999999 | 3.525 |
| 0.8006944444444444 | 3.525 |
| 0.8013888888888889 | 3.525 |
| 0.8020833333333334 | 3.525 |
| 0.8027777777777777 | 3.525 |
| 0.8034722222222223 | 3.525 |
| 0.8041666666666667 | 3.525 |
| 0.8048611111111111 | 3.525 |
| 0.8055555555555555 | 3.525 |
| 0.80625 | 3.525 |
| 0.8069444444444445 | 3.525 |
| 0.8076388888888889 | 3.525 |
| 0.8083333333333332 | 3.525 |
| 0.8090277777777778 | 3.525 |
| 0.8097222222222222 | 3.525 |
| 0.8104166666666667 | 3.525 |
| 0.811111111111111 | 3.525 |
| 0.8118055555555556 | 3.525 |
| 0.8125 | 3.525 |
| 0.8131944444444444 | 3.525 |
| 0.813888888888889 | 3.525 |
| 0.8145833333333333 | 3.525 |
| 0.8152777777777778 | 0 |
| 0.8159722222222222 | 0 |
| 0.8166666666666668 | 3.525 |
| 0.8173611111111111 | 0 |
| 0.8180555555555555 | 0 |
| 0.81875 | 0 |
| 0.8194444444444445 | 0 |
| 0.8201388888888889 | 0 |
| 0.8208333333333333 | 0 |
| 0.8215277777777777 | 0 |
| 0.8222222222222223 | 0 |
| 0.8229166666666666 | 0 |
| 0.8236111111111111 | 0 |
| 0.8243055555555556 | 0 |
| 0.8250000000000001 | 0 |
| 0.8256944444444444 | 0 |
| 0.8263888888888888 | 0 |
| 0.8270833333333334 | 0 |
| 0.8277777777777778 | 0 |
| 0.8284722222222222 | 0 |
| 0.8291666666666666 | 0 |
| 0.8298611111111112 | 0 |
| 0.8305555555555556 | 0 |
| 0.8312499999999999 | 0 |
| 0.8319444444444444 | 0 |
| 0.8326388888888889 | 0 |
| 0.8333333333333334 | 0 |
| 0.8340277777777777 | 0 |
| 0.8347222222222223 | 0 |
| 0.8354166666666667 | 0 |
| 0.8361111111111111 | 0 |
| 0.8368055555555555 | 0 |
| 0.8375 | 0 |
| 0.8381944444444445 | 0 |
| 0.8388888888888889 | 0 |
| 0.8395833333333332 | 0 |
| 0.8402777777777778 | 0 |
| 0.8409722222222222 | 0 |
| 0.8416666666666667 | 0 |
| 0.842361111111111 | 0 |
| 0.8430555555555556 | 0 |
| 0.84375 | 0 |
| 0.8444444444444444 | 0 |
| 0.845138888888889 | 0 |
| 0.8458333333333333 | 0 |
| 0.8465277777777778 | 0 |
| 0.8472222222222222 | 0 |
| 0.8479166666666668 | 0 |
| 0.8486111111111111 | 0 |
| 0.8493055555555555 | 0 |
| 0.85 | 0 |
| 0.8506944444444445 | 0 |
| 0.8513888888888889 | 0 |
| 0.8520833333333333 | 0 |
| 0.8527777777777777 | 0 |
| 0.8534722222222223 | 0 |
| 0.8541666666666666 | 0 |
| 0.8548611111111111 | 0 |
| 0.8555555555555556 | 0 |
| 0.8562500000000001 | 0 |
| 0.8569444444444444 | 0 |
| 0.8576388888888888 | 0 |
| 0.8583333333333334 | 0 |
| 0.8590277777777778 | 0 |
| 0.8597222222222222 | 0 |
| 0.8604166666666666 | 0 |
| 0.8611111111111112 | 0 |
| 0.8618055555555556 | 0 |
| 0.8624999999999999 | 0 |
| 0.8631944444444444 | 0 |
| 0.8638888888888889 | 0 |
| 0.8645833333333334 | 0 |
| 0.8652777777777777 | 0 |
| 0.8659722222222223 | 0 |
| 0.8666666666666667 | 0 |
| 0.8673611111111111 | 0 |
| 0.8680555555555555 | 0 |
| 0.86875 | 0 |
| 0.8694444444444445 | 0 |
| 0.8701388888888889 | 0 |
| 0.8708333333333332 | 0 |
| 0.8715277777777778 | 0 |
| 0.8722222222222222 | 0 |
| 0.8729166666666667 | 0 |
| 0.873611111111111 | 0 |
| 0.8743055555555556 | 0 |
| 0.875 | 0 |
| 0.8756944444444444 | 0 |
| 0.876388888888889 | 0 |
| 0.8770833333333333 | 0 |
| 0.8777777777777778 | 0 |
| 0.8784722222222222 | 0 |
| 0.8791666666666668 | 0 |
| 0.8798611111111111 | 0 |
| 0.8805555555555555 | 0 |
| 0.88125 | 0 |
| 0.8819444444444445 | 0 |
| 0.8826388888888889 | 0 |
| 0.8833333333333333 | 0 |
| 0.8840277777777777 | 0 |
| 0.8847222222222223 | 0 |
| 0.8854166666666666 | 0 |
| 0.8861111111111111 | 0 |
| 0.8868055555555556 | 0 |
| 0.8875000000000001 | 0 |
| 0.8881944444444444 | 0 |
| 0.8888888888888888 | 0 |
| 0.8895833333333334 | 0 |
| 0.8902777777777778 | 0 |
| 0.8909722222222222 | 0 |
| 0.8916666666666666 | 0 |
| 0.8923611111111112 | 0 |
| 0.8930555555555556 | 0 |
| 0.8937499999999999 | 0 |
| 0.8944444444444444 | 0 |
| 0.8951388888888889 | 0 |
| 0.8958333333333334 | 0 |
| 0.8965277777777777 | 0 |
| 0.8972222222222223 | 0 |
| 0.8979166666666667 | 0 |
| 0.8986111111111111 | 0 |
| 0.8993055555555555 | 0 |
| 0.9 | 0 |
| 0.9006944444444445 | 0 |
| 0.9013888888888889 | 0 |
| 0.9020833333333332 | 0 |
| 0.9027777777777778 | 0 |
| 0.9034722222222222 | 0 |
| 0.9041666666666667 | 0 |
| 0.904861111111111 | 0 |
| 0.9055555555555556 | 0 |
| 0.90625 | 0 |
| 0.9069444444444444 | 0 |
| 0.907638888888889 | 0 |
| 0.9083333333333333 | 0 |
| 0.9090277777777778 | 0 |
| 0.9097222222222222 | 0 |
| 0.9104166666666668 | 0 |
| 0.9111111111111111 | 0 |
| 0.9118055555555555 | 0 |
| 0.9125 | 0 |
| 0.9131944444444445 | 0 |
| 0.9138888888888889 | 0 |
| 0.9145833333333333 | 0 |
| 0.9152777777777777 | 0 |
| 0.9159722222222223 | 0 |
| 0.9166666666666666 | 0 |
| 0.9173611111111111 | 0 |
| 0.9180555555555556 | 0 |
| 0.9187500000000001 | 0 |
| 0.9194444444444444 | 0 |
| 0.9201388888888888 | 0 |
| 0.9208333333333334 | 0 |
| 0.9215277777777778 | 0 |
| 0.9222222222222222 | 0 |
| 0.9229166666666666 | 0 |
| 0.9236111111111112 | 0 |
| 0.9243055555555556 | 0 |
| 0.9249999999999999 | 0 |
| 0.9256944444444444 | 0 |
| 0.9263888888888889 | 0 |
| 0.9270833333333334 | 0 |
| 0.9277777777777777 | 0 |
| 0.9284722222222223 | 0 |
| 0.9291666666666667 | 0 |
| 0.9298611111111111 | 0 |
| 0.9305555555555555 | 0 |
| 0.93125 | 0 |
| 0.9319444444444445 | 0 |
| 0.9326388888888889 | 0 |
| 0.9333333333333332 | 0 |
| 0.9340277777777778 | 0 |
| 0.9347222222222222 | 0 |
| 0.9354166666666667 | 0 |
| 0.936111111111111 | 0 |
| 0.9368055555555556 | 0 |
| 0.9375 | 0 |
| 0.9381944444444444 | 0 |
| 0.938888888888889 | 0 |
| 0.9395833333333333 | 0 |
| 0.9402777777777778 | 0 |
| 0.9409722222222222 | 0 |
| 0.9416666666666668 | 0 |
| 0.9423611111111111 | 0 |
| 0.9430555555555555 | 0 |
| 0.94375 | 0 |
| 0.9444444444444445 | 0 |
| 0.9451388888888889 | 0 |
| 0.9458333333333333 | 0 |
| 0.9465277777777777 | 0 |
| 0.9472222222222223 | 0 |
| 0.9479166666666666 | 0 |
| 0.9486111111111111 | 0 |
| 0.9493055555555556 | 0 |
| 0.9500000000000001 | 0 |
| 0.9506944444444444 | 0 |
| 0.9513888888888888 | 0 |
| 0.9520833333333334 | 0 |
| 0.9527777777777778 | 0 |
| 0.9534722222222222 | 0 |
| 0.9541666666666666 | 0 |
| 0.9548611111111112 | 0 |
| 0.9555555555555556 | 0 |
| 0.9562499999999999 | 0 |
| 0.9569444444444444 | 0 |
| 0.9576388888888889 | 0 |
| 0.9583333333333334 | 0 |
| 0.9590277777777777 | 0 |
| 0.9597222222222223 | 0 |
| 0.9604166666666667 | 0 |
| 0.9611111111111111 | 0 |
| 0.9618055555555555 | 0 |
| 0.9625 | 0 |
| 0.9631944444444445 | 0 |
| 0.9638888888888889 | 0 |
| 0.9645833333333332 | 0 |
| 0.9652777777777778 | 0 |
| 0.9659722222222222 | 0 |
| 0.9666666666666667 | 0 |
| 0.967361111111111 | 0 |
| 0.9680555555555556 | 0 |
| 0.96875 | 0 |
| 0.9694444444444444 | 0 |
| 0.970138888888889 | 0 |
| 0.9708333333333333 | 0 |
| 0.9715277777777778 | 0 |
| 0.9722222222222222 | 0 |
| 0.9729166666666668 | 0 |
| 0.9736111111111111 | 0 |
| 0.9743055555555555 | 0 |
| 0.975 | 0 |
| 0.9756944444444445 | 0 |
| 0.9763888888888889 | 0 |
| 0.9770833333333333 | 0 |
| 0.9777777777777777 | 0 |
| 0.9784722222222223 | 0 |
| 0.9791666666666666 | 0 |
| 0.9798611111111111 | 0 |
| 0.9805555555555556 | 0 |
| 0.9812500000000001 | 0 |
| 0.9819444444444444 | 0 |
| 0.9826388888888888 | 0 |
| 0.9833333333333334 | 0 |
| 0.9840277777777778 | 0 |
| 0.9847222222222222 | 0 |
| 0.9854166666666666 | 0 |
| 0.9861111111111112 | 0 |
| 0.9868055555555556 | 0 |
| 0.9874999999999999 | 0 |
| 0.9881944444444444 | 0 |
| 0.9888888888888889 | 0 |
| 0.9895833333333334 | 0 |
| 0.9902777777777777 | 0 |
| 0.9909722222222223 | 0 |
| 0.9916666666666667 | 0 |
| 0.9923611111111111 | 0 |
| 0.9930555555555555 | 0 |
| 0.99375 | 0 |
| 0.9944444444444445 | 0 |
| 0.9951388888888889 | 0 |
| 0.9958333333333332 | 0 |
| 0.9965277777777778 | 0 |
| 0.9972222222222222 | 0 |
| 0.9979166666666667 | 0 |
| 0.998611111111111 | 0 |
| 0.9993055555555556 | 0 |